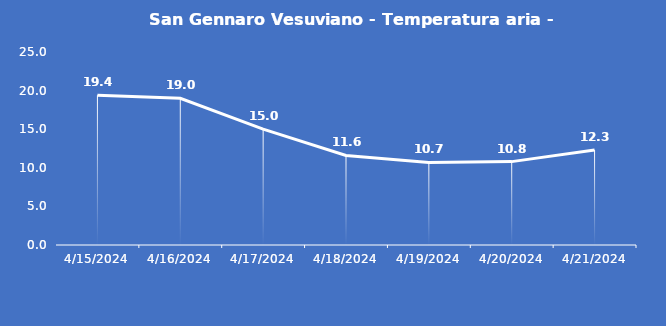
| Category | San Gennaro Vesuviano - Temperatura aria - Grezzo (°C) |
|---|---|
| 4/15/24 | 19.4 |
| 4/16/24 | 19 |
| 4/17/24 | 15 |
| 4/18/24 | 11.6 |
| 4/19/24 | 10.7 |
| 4/20/24 | 10.8 |
| 4/21/24 | 12.3 |